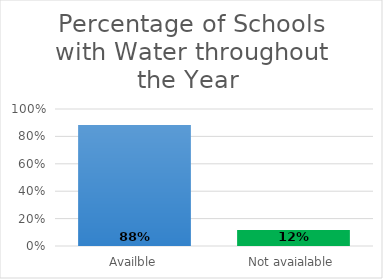
| Category | Series 0 |
|---|---|
| Availble | 0.883 |
| Not avaialable | 0.117 |